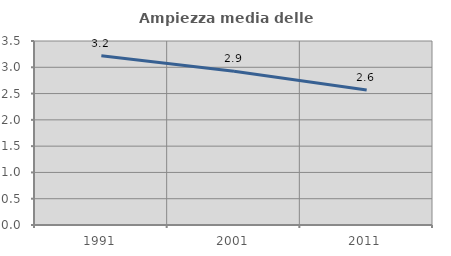
| Category | Ampiezza media delle famiglie |
|---|---|
| 1991.0 | 3.221 |
| 2001.0 | 2.923 |
| 2011.0 | 2.566 |